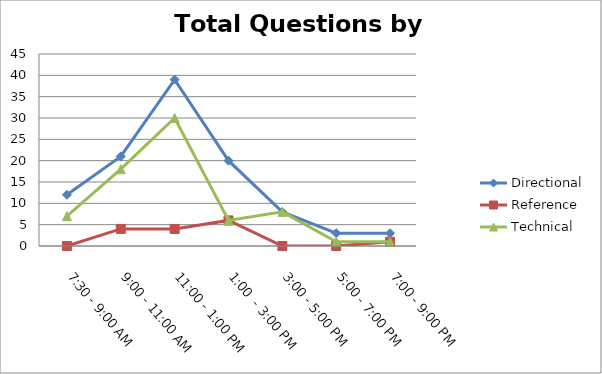
| Category | Directional | Reference | Technical |
|---|---|---|---|
| 7:30 - 9:00 AM | 12 | 0 | 7 |
| 9:00 - 11:00 AM | 21 | 4 | 18 |
| 11:00 - 1:00 PM | 39 | 4 | 30 |
| 1:00  - 3:00 PM | 20 | 6 | 6 |
| 3:00 - 5:00 PM | 8 | 0 | 8 |
| 5:00 - 7:00 PM | 3 | 0 | 1 |
| 7:00 - 9:00 PM | 3 | 1 | 1 |